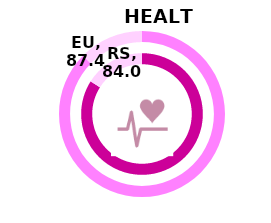
| Category | RS | Series 1 | EU |
|---|---|---|---|
| Index | 84 |  | 87.4 |
| Rest | 16 |  | 12.6 |